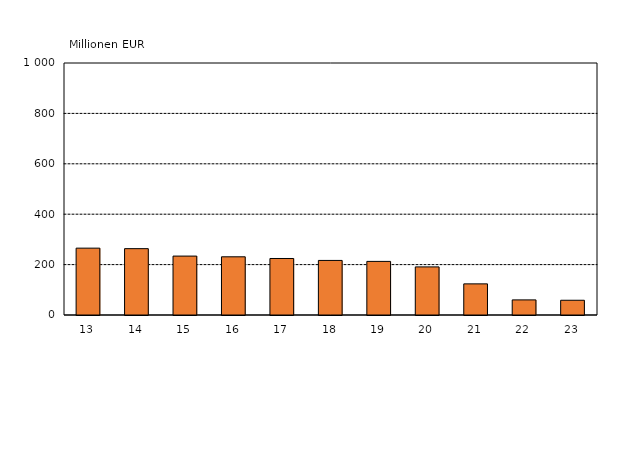
| Category | Series 0 |
|---|---|
| 13 | 265.265 |
| 14 | 263.282 |
| 15 | 233.796 |
| 16 | 230.945 |
| 17 | 224.251 |
| 18 | 216.556 |
| 19 | 212.692 |
| 20 | 190.881 |
| 21 | 123.537 |
| 22 | 59.948 |
| 23 | 58.474 |